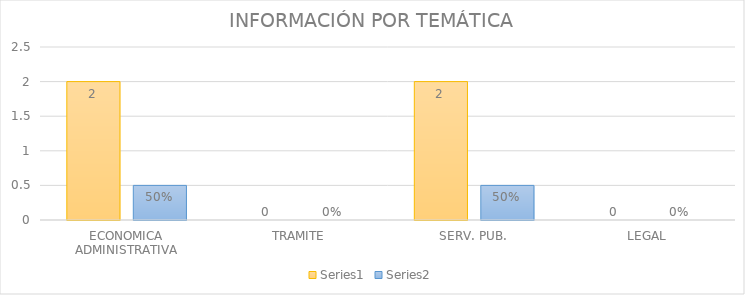
| Category | Series 3 | Series 4 |
|---|---|---|
| ECONOMICA ADMINISTRATIVA | 2 | 0.5 |
| TRAMITE | 0 | 0 |
| SERV. PUB. | 2 | 0.5 |
| LEGAL | 0 | 0 |